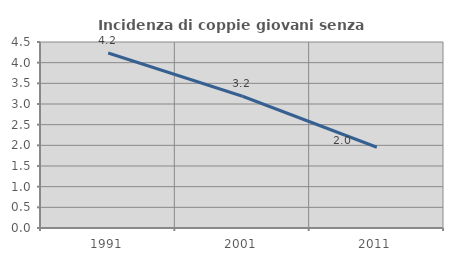
| Category | Incidenza di coppie giovani senza figli |
|---|---|
| 1991.0 | 4.234 |
| 2001.0 | 3.187 |
| 2011.0 | 1.953 |